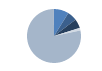
| Category | Series 0 |
|---|---|
| ARRASTRE | 101 |
| CERCO | 66 |
| PALANGRE | 62 |
| REDES DE ENMALLE | 18 |
| ARTES MENORES | 888 |
| SIN TIPO ASIGNADO | 2 |